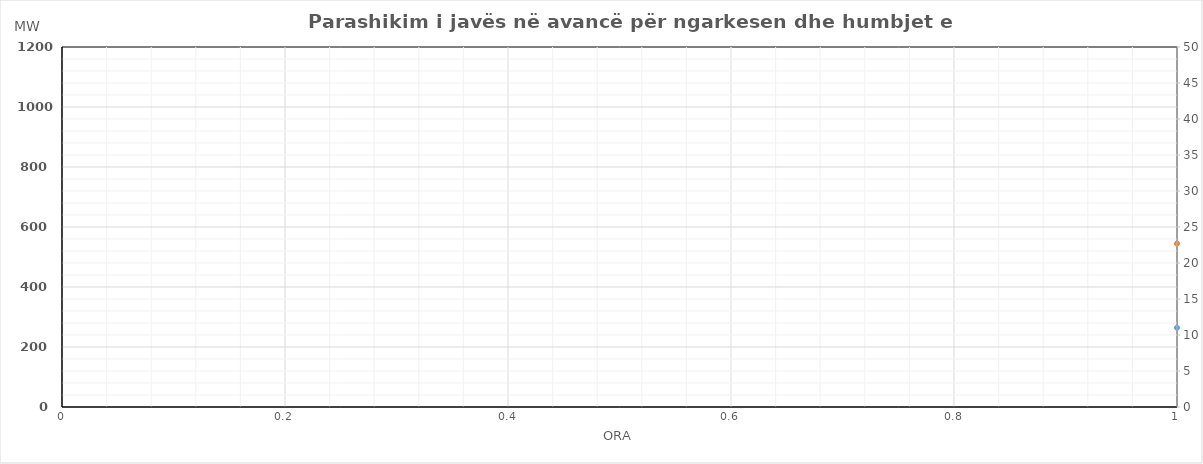
| Category | Ngarkesa (MWh) |
|---|---|
| 0 | 544.455 |
| 1 | 480.711 |
| 2 | 450.621 |
| 3 | 439.987 |
| 4 | 450.039 |
| 5 | 501.025 |
| 6 | 603.612 |
| 7 | 764.572 |
| 8 | 916.522 |
| 9 | 994.801 |
| 10 | 1020.937 |
| 11 | 1035.597 |
| 12 | 1035.67 |
| 13 | 1037.455 |
| 14 | 1005.666 |
| 15 | 998.725 |
| 16 | 1069.658 |
| 17 | 1131.661 |
| 18 | 1117.362 |
| 19 | 1100.344 |
| 20 | 1051.091 |
| 21 | 952.276 |
| 22 | 810.801 |
| 23 | 660.654 |
| 24 | 540.199 |
| 25 | 472.609 |
| 26 | 442.549 |
| 27 | 430.704 |
| 28 | 440.356 |
| 29 | 493.585 |
| 30 | 624.017 |
| 31 | 810.591 |
| 32 | 920.6 |
| 33 | 972.528 |
| 34 | 974.632 |
| 35 | 978.569 |
| 36 | 980.797 |
| 37 | 980.77 |
| 38 | 965.289 |
| 39 | 964.038 |
| 40 | 1043.094 |
| 41 | 1119.081 |
| 42 | 1115.949 |
| 43 | 1103.219 |
| 44 | 1059.376 |
| 45 | 959.419 |
| 46 | 812.726 |
| 47 | 658.003 |
| 48 | 536.214 |
| 49 | 472.588 |
| 50 | 443.339 |
| 51 | 431.121 |
| 52 | 444.613 |
| 53 | 495.72 |
| 54 | 617.045 |
| 55 | 793.932 |
| 56 | 908.571 |
| 57 | 964.093 |
| 58 | 974.429 |
| 59 | 981.63 |
| 60 | 980.468 |
| 61 | 988.829 |
| 62 | 969.745 |
| 63 | 964.195 |
| 64 | 1037.558 |
| 65 | 1110.394 |
| 66 | 1109.514 |
| 67 | 1100.718 |
| 68 | 1061.919 |
| 69 | 961.577 |
| 70 | 810.387 |
| 71 | 658.163 |
| 72 | 536.365 |
| 73 | 473.097 |
| 74 | 443.041 |
| 75 | 432.305 |
| 76 | 446.582 |
| 77 | 508.491 |
| 78 | 667.36 |
| 79 | 887.364 |
| 80 | 954.082 |
| 81 | 953.042 |
| 82 | 921.416 |
| 83 | 891.041 |
| 84 | 872.342 |
| 85 | 898.422 |
| 86 | 916.678 |
| 87 | 938.112 |
| 88 | 1019.35 |
| 89 | 1097.728 |
| 90 | 1097.663 |
| 91 | 1083.542 |
| 92 | 1038.527 |
| 93 | 945.771 |
| 94 | 799.862 |
| 95 | 651.034 |
| 96 | 543.828 |
| 97 | 484.01 |
| 98 | 454.436 |
| 99 | 445.46 |
| 100 | 452.311 |
| 101 | 512.792 |
| 102 | 649.664 |
| 103 | 849.996 |
| 104 | 950.219 |
| 105 | 968.133 |
| 106 | 948.583 |
| 107 | 926.258 |
| 108 | 911.029 |
| 109 | 928.559 |
| 110 | 937.718 |
| 111 | 958.605 |
| 112 | 1037.687 |
| 113 | 1104.035 |
| 114 | 1098.744 |
| 115 | 1081.016 |
| 116 | 1029.405 |
| 117 | 937.351 |
| 118 | 801.771 |
| 119 | 651.72 |
| 120 | 545.487 |
| 121 | 488.388 |
| 122 | 458.858 |
| 123 | 444.62 |
| 124 | 453.87 |
| 125 | 513.363 |
| 126 | 652.717 |
| 127 | 834.711 |
| 128 | 939.256 |
| 129 | 958.683 |
| 130 | 937.57 |
| 131 | 919.067 |
| 132 | 916.197 |
| 133 | 934.568 |
| 134 | 942.312 |
| 135 | 964.314 |
| 136 | 1036.059 |
| 137 | 1088.861 |
| 138 | 1074.49 |
| 139 | 1059.689 |
| 140 | 1009.402 |
| 141 | 916.921 |
| 142 | 793.488 |
| 143 | 659.32 |
| 144 | 553.357 |
| 145 | 492.687 |
| 146 | 465.435 |
| 147 | 454.485 |
| 148 | 461.475 |
| 149 | 516.411 |
| 150 | 638.607 |
| 151 | 808.41 |
| 152 | 929.207 |
| 153 | 962.945 |
| 154 | 954.73 |
| 155 | 951.746 |
| 156 | 944.002 |
| 157 | 964.573 |
| 158 | 970.727 |
| 159 | 981.065 |
| 160 | 1038.434 |
| 161 | 1071.637 |
| 162 | 1060.144 |
| 163 | 1032.994 |
| 164 | 975.906 |
| 165 | 879.148 |
| 166 | 772.799 |
| 167 | 648.901 |